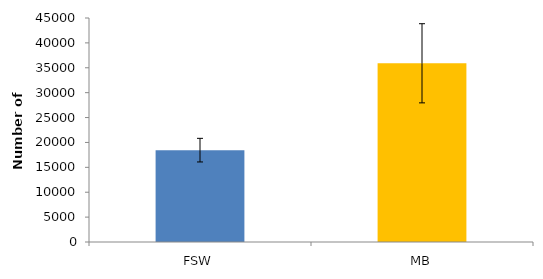
| Category | Series 0 |
|---|---|
| FSW | 18452.347 |
| MB | 35901.065 |